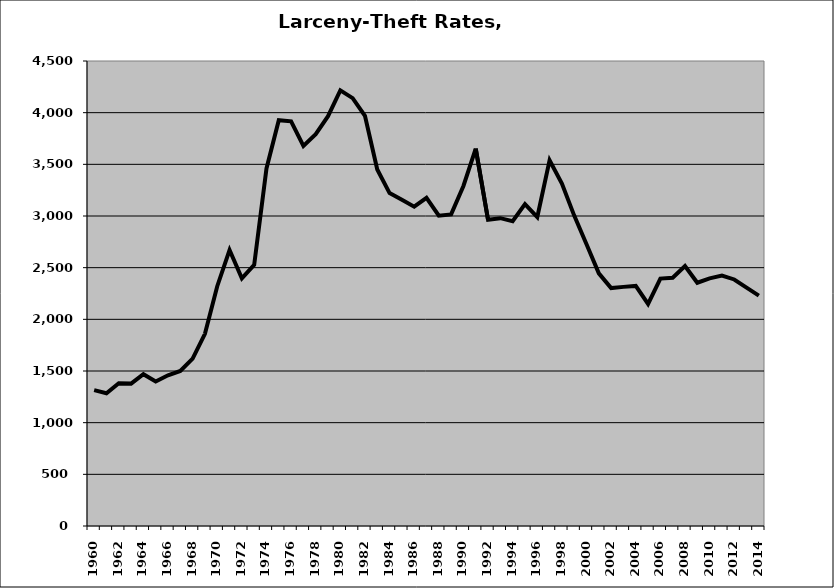
| Category | Larceny-Theft |
|---|---|
| 1960.0 | 1314.61 |
| 1961.0 | 1284.934 |
| 1962.0 | 1381.45 |
| 1963.0 | 1377.941 |
| 1964.0 | 1468.635 |
| 1965.0 | 1398.416 |
| 1966.0 | 1458.789 |
| 1967.0 | 1500.191 |
| 1968.0 | 1619.288 |
| 1969.0 | 1859.815 |
| 1970.0 | 2320.363 |
| 1971.0 | 2670.609 |
| 1972.0 | 2397.168 |
| 1973.0 | 2526.389 |
| 1974.0 | 3459.86 |
| 1975.0 | 3926.943 |
| 1976.0 | 3915.808 |
| 1977.0 | 3678.351 |
| 1978.0 | 3792.624 |
| 1979.0 | 3965.808 |
| 1980.0 | 4216.188 |
| 1981.0 | 4140.301 |
| 1982.0 | 3968.605 |
| 1983.0 | 3450.165 |
| 1984.0 | 3221.37 |
| 1985.0 | 3157.235 |
| 1986.0 | 3090.363 |
| 1987.0 | 3175.932 |
| 1988.0 | 3003.636 |
| 1989.0 | 3015.453 |
| 1990.0 | 3290.761 |
| 1991.0 | 3652.353 |
| 1992.0 | 2963.57 |
| 1993.0 | 2979 |
| 1994.0 | 2950.142 |
| 1995.0 | 3114.226 |
| 1996.0 | 2988.276 |
| 1997.0 | 3538.798 |
| 1998.0 | 3313.038 |
| 1999.0 | 3003.697 |
| 2000.0 | 2725.881 |
| 2001.0 | 2444.894 |
| 2002.0 | 2302.266 |
| 2003.0 | 2314.078 |
| 2004.0 | 2323.301 |
| 2005.0 | 2148.523 |
| 2006.0 | 2394.092 |
| 2007.0 | 2402.274 |
| 2008.0 | 2515.947 |
| 2009.0 | 2354.026 |
| 2010.0 | 2396.501 |
| 2011.0 | 2422.652 |
| 2012.0 | 2385.904 |
| 2013.0 | 2307.185 |
| 2014.0 | 2230.086 |